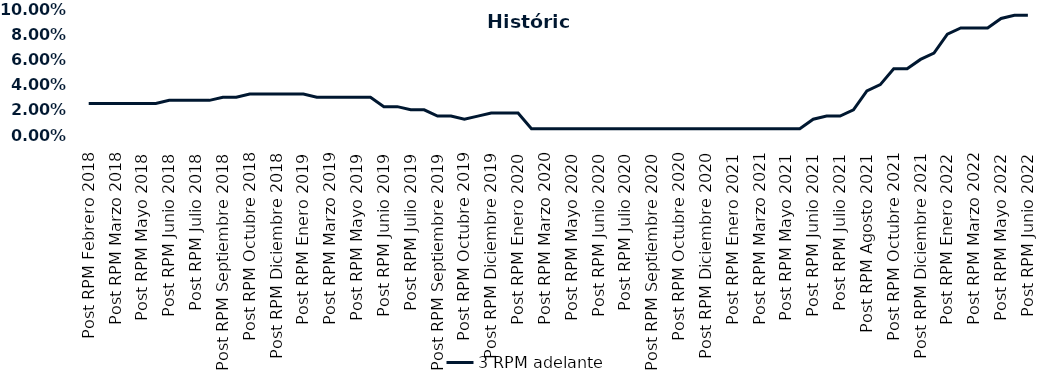
| Category | 3 RPM adelante |
|---|---|
| Post RPM Febrero 2018 | 0.025 |
| Pre RPM Marzo 2018 | 0.025 |
| Post RPM Marzo 2018 | 0.025 |
| Pre RPM Mayo 2018 | 0.025 |
| Post RPM Mayo 2018 | 0.025 |
| Pre RPM Junio 2018 | 0.025 |
| Post RPM Junio 2018 | 0.028 |
| Pre RPM Julio 2018 | 0.028 |
| Post RPM Julio 2018 | 0.028 |
| Pre RPM Septiembre 2018 | 0.028 |
| Post RPM Septiembre 2018 | 0.03 |
| Pre RPM Octubre 2018 | 0.03 |
| Post RPM Octubre 2018 | 0.032 |
| Pre RPM Diciembre 2018 | 0.032 |
| Post RPM Diciembre 2018 | 0.032 |
| Pre RPM Enero 2019 | 0.032 |
| Post RPM Enero 2019 | 0.032 |
| Pre RPM Marzo 2019 | 0.03 |
| Post RPM Marzo 2019 | 0.03 |
| Pre RPM Mayo 2019 | 0.03 |
| Post RPM Mayo 2019 | 0.03 |
| Pre RPM Junio 2019 | 0.03 |
| Post RPM Junio 2019 | 0.022 |
| Pre RPM Julio 2019 | 0.022 |
| Post RPM Julio 2019 | 0.02 |
| Pre RPM Septiembre 2019 | 0.02 |
| Post RPM Septiembre 2019 | 0.015 |
| Pre RPM Octubre 2019 | 0.015 |
| Post RPM Octubre 2019 | 0.012 |
| Pre RPM Diciembre 2019 | 0.015 |
| Post RPM Diciembre 2019 | 0.018 |
| Pre RPM Enero 2020 | 0.018 |
| Post RPM Enero 2020 | 0.018 |
| Pre RPM Marzo 2020 | 0.005 |
| Post RPM Marzo 2020 | 0.005 |
| Pre RPM Mayo 2020 | 0.005 |
| Post RPM Mayo 2020 | 0.005 |
| Pre RPM Junio 2020 | 0.005 |
| Post RPM Junio 2020 | 0.005 |
| Pre RPM Julio 2020 | 0.005 |
| Post RPM Julio 2020 | 0.005 |
| Pre RPM Septiembre 2020 | 0.005 |
| Post RPM Septiembre 2020 | 0.005 |
| Pre RPM Octubre 2020 | 0.005 |
| Post RPM Octubre 2020 | 0.005 |
| Pre RPM Diciembre 2020 | 0.005 |
| Post RPM Diciembre 2020 | 0.005 |
| Pre RPM Enero 2021 | 0.005 |
| Post RPM Enero 2021 | 0.005 |
| Pre RPM Marzo 2021 | 0.005 |
| Post RPM Marzo 2021 | 0.005 |
| Pre RPM Mayo 2021 | 0.005 |
| Post RPM Mayo 2021 | 0.005 |
| Pre RPM Junio 2021 | 0.005 |
| Post RPM Junio 2021 | 0.012 |
| Pre RPM Julio 2021 | 0.015 |
| Post RPM Julio 2021 | 0.015 |
| Pre RPM Agosto 2021 | 0.02 |
| Post RPM Agosto 2021 | 0.035 |
| Pre RPM Octubre 2021 | 0.04 |
| Post RPM Octubre 2021 | 0.052 |
| Pre RPM Diciembre 2021 | 0.052 |
| Post RPM Diciembre 2021 | 0.06 |
| Pre RPM Enero 2022 | 0.065 |
| Post RPM Enero 2022 | 0.08 |
| Pre RPM Marzo 2022 | 0.085 |
| Post RPM Marzo 2022 | 0.085 |
| Pre RPM Mayo 2022 | 0.085 |
| Post RPM Mayo 2022 | 0.092 |
| Pre RPM Junio 2022 | 0.095 |
| Post RPM Junio 2022 | 0.095 |